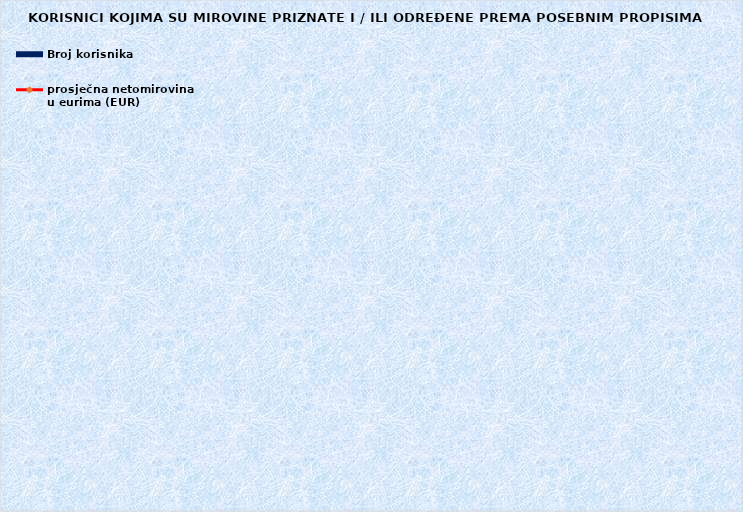
| Category | Broj korisnika |
|---|---|
|      a) radnici na poslovima ovlaštenih službenih osoba u tijelima unutarnjih 
poslova i pravosuđa, kojima je pravo na mirovinu priznato prema propisima
koji su bili na snazi do stupanja na snagu Zakona o pravima iz mirovinskog
osiguranja DVO, PS i OSO | 6978 |
|      b) radnici na  poslovima policijskih službenika, ovlaštenih službenih osoba pravosuđa i službene osobe s posebnim dužnostima i ovlastima u sigurnosno obavještajnom sustavu RH koji su pravo na mirovinu ostvarili prema Zakonu o pravima DVO, PS i OSO | 9537 |
|      c) radnici na poslovima razminiranja | 672 |
| Korisnici koji pravo na mirovinu ostvaruju prema Zakonu o vatrogastvu (NN 125/19)* | 367 |
| Djelatne vojne osobe - DVO  | 16060 |
| Pripadnici Hrvatske domovinske vojske od 1941. do 1945. godine | 1830 |
| Bivši politički zatvorenici | 2043 |
| Hrvatski branitelji iz Domovinskog rata - ZOHBDR | 71267 |
| Mirovine priznate prema općim propisima, a određene prema
ZOHBDR - u iz 2017. (čl. 27., 35., 48. i 49. stavak 2.)  | 58043 |
| Pripadnici bivše Jugoslavenske narodne armije - JNA | 3568 |
| Pripadnici bivše Jugoslavenske narodne armije - JNA - čl. 185 ZOMO | 153 |
| Sudionici Narodnooslobodilačkog rata - NOR | 4774 |
| Zastupnici u Hrvatskom saboru, članovi Vlade, suci Ustavnog suda i glavni državni revizor  | 680 |
| Članovi Izvršnog vijeća Sabora, Saveznog izvršnog vijeća i administrativno umirovljeni javni službenici | 63 |
| Bivši službenici u saveznim tijelima bivše SFRJ - članak 38. ZOMO | 17 |
| Redoviti članovi Hrvatske akademije znanosti i umjetnosti - HAZU | 123 |
| Radnici u Istarskim ugljenokopima "Tupljak" d.d. Labin  | 245 |
| Radnici profesionalno izloženi azbestu | 816 |
| Osiguranici - članovi posade broda u međunarodnoj plovidbi i nacionalnoj plovidbi - članak 129. a stavak 2. Pomorskog zakonika | 203 |
| Pripadnici Hrvatskog vijeća obrane  - HVO  | 6730 |